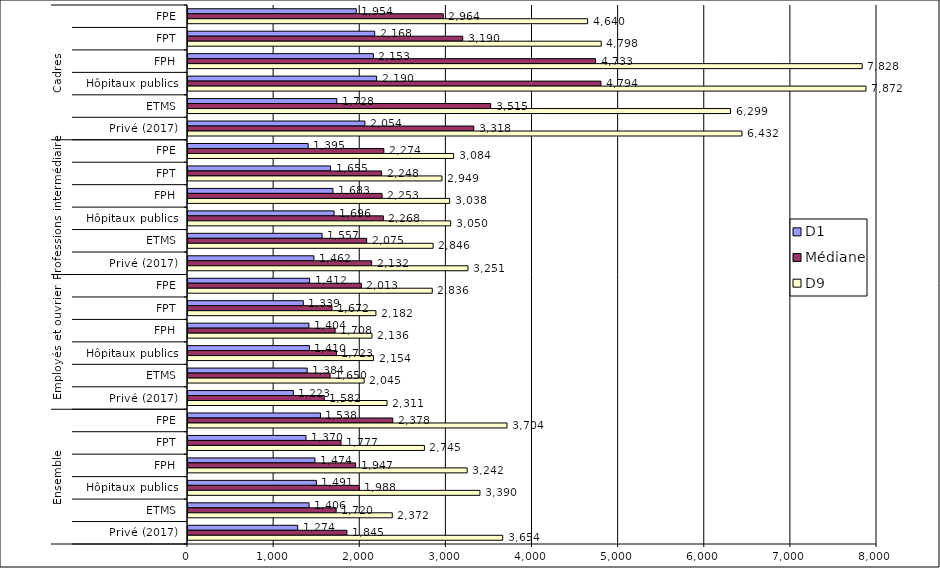
| Category | D1 | Médiane | D9 |
|---|---|---|---|
| 0 | 1954 | 2964 | 4640 |
| 1 | 2168 | 3190 | 4798 |
| 2 | 2153 | 4733 | 7828 |
| 3 | 2190 | 4794 | 7872 |
| 4 | 1728 | 3515 | 6299 |
| 5 | 2054 | 3318 | 6432 |
| 6 | 1395 | 2274 | 3084 |
| 7 | 1655 | 2248 | 2949 |
| 8 | 1683 | 2253 | 3038 |
| 9 | 1696 | 2268 | 3050 |
| 10 | 1557 | 2075 | 2846 |
| 11 | 1462 | 2132 | 3251 |
| 12 | 1412 | 2013 | 2836 |
| 13 | 1339 | 1672 | 2182 |
| 14 | 1404 | 1708 | 2136 |
| 15 | 1410 | 1723 | 2154 |
| 16 | 1384 | 1650 | 2045 |
| 17 | 1223 | 1582 | 2311 |
| 18 | 1538 | 2378 | 3704 |
| 19 | 1370 | 1777 | 2745 |
| 20 | 1474 | 1947 | 3242 |
| 21 | 1491 | 1988 | 3390 |
| 22 | 1406 | 1720 | 2372 |
| 23 | 1274 | 1845 | 3654 |